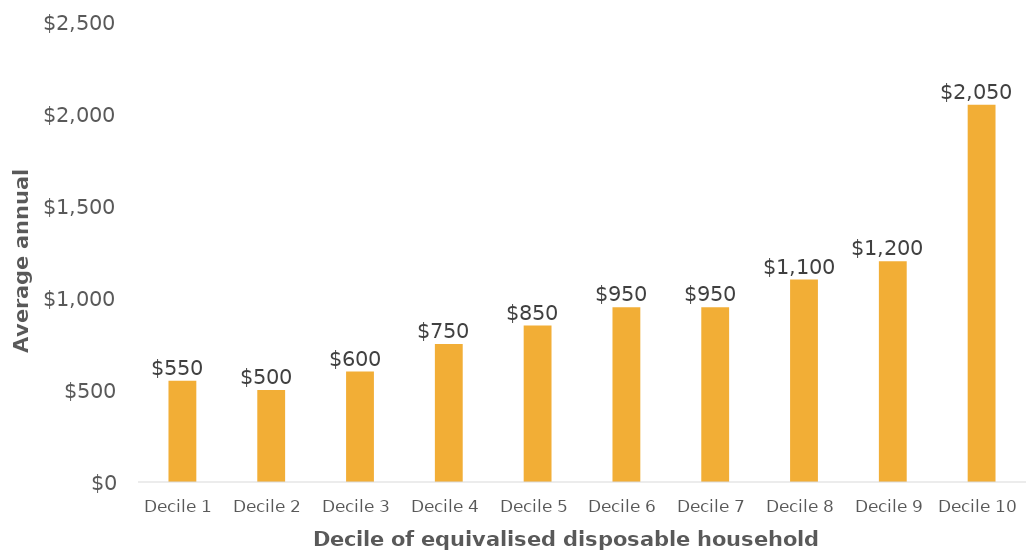
| Category | GST rate to 13.5% |
|---|---|
| Decile 1 | 550 |
| Decile 2 | 500 |
| Decile 3 | 600 |
| Decile 4 | 750 |
| Decile 5 | 850 |
| Decile 6 | 950 |
| Decile 7 | 950 |
| Decile 8 | 1100 |
| Decile 9 | 1200 |
| Decile 10 | 2050 |